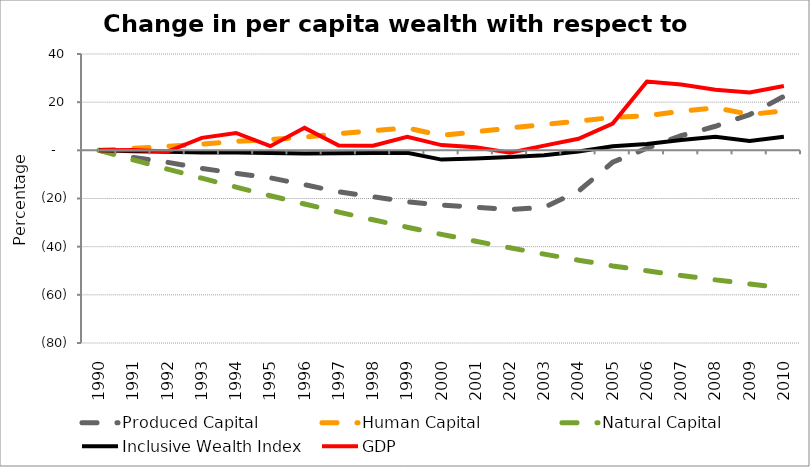
| Category | Produced Capital  | Human Capital | Natural Capital | Inclusive Wealth Index | GDP |
|---|---|---|---|---|---|
| 1990.0 | 0 | 0 | 0 | 0 | 0 |
| 1991.0 | -2.945 | 0.801 | -3.983 | -0.417 | 0.105 |
| 1992.0 | -4.951 | 1.7 | -7.786 | -0.617 | -0.48 |
| 1993.0 | -7.494 | 2.538 | -11.565 | -0.924 | 5.185 |
| 1994.0 | -9.534 | 3.736 | -15.269 | -0.899 | 7.208 |
| 1995.0 | -11.417 | 4.503 | -18.856 | -1.144 | 1.727 |
| 1996.0 | -14.28 | 5.498 | -22.3 | -1.327 | 9.336 |
| 1997.0 | -17.214 | 6.933 | -25.635 | -1.186 | 1.986 |
| 1998.0 | -19.28 | 8.167 | -28.841 | -1.06 | 1.88 |
| 1999.0 | -21.356 | 9.28 | -31.923 | -1.003 | 5.611 |
| 2000.0 | -22.718 | 6.199 | -34.9 | -3.851 | 2.172 |
| 2001.0 | -23.604 | 7.68 | -37.755 | -3.344 | 1.251 |
| 2002.0 | -24.623 | 9.267 | -40.473 | -2.756 | -0.987 |
| 2003.0 | -23.692 | 10.706 | -43.096 | -2.015 | 1.959 |
| 2004.0 | -16.96 | 12.177 | -45.608 | -0.502 | 4.818 |
| 2005.0 | -4.944 | 13.64 | -47.991 | 1.689 | 11.119 |
| 2006.0 | 0.877 | 14.403 | -50.018 | 2.654 | 28.595 |
| 2007.0 | 6.103 | 16.232 | -51.962 | 4.322 | 27.307 |
| 2008.0 | 9.986 | 17.708 | -53.781 | 5.588 | 25.158 |
| 2009.0 | 14.816 | 14.894 | -55.486 | 3.909 | 24.033 |
| 2010.0 | 22.412 | 16.354 | -57.132 | 5.658 | 26.733 |